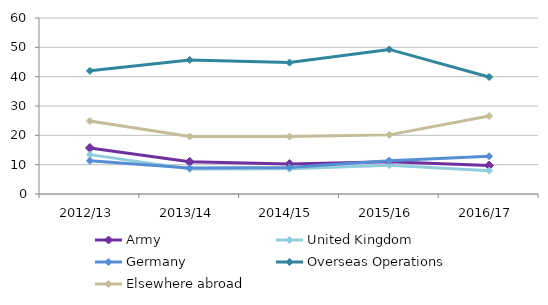
| Category | Army | United Kingdom | Germany | Overseas Operations | Elsewhere abroad |
|---|---|---|---|---|---|
| 2012/13 | 15.714 | 13.424 | 11.319 | 41.979 | 24.896 |
| 2013/14 | 10.971 | 8.49 | 8.873 | 45.712 | 19.603 |
| 2014/15 | 10.214 | 8.604 | 9.034 | 44.803 | 19.573 |
| 2015/16 | 11.005 | 9.791 | 11.323 | 49.287 | 20.156 |
| 2016/17 | 9.682 | 7.957 | 12.865 | 39.889 | 26.573 |